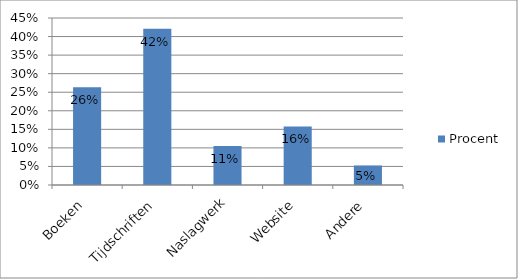
| Category | Procent |
|---|---|
| Boeken | 0.263 |
| Tijdschriften | 0.421 |
| Naslagwerk | 0.105 |
| Website | 0.158 |
| Andere | 0.053 |